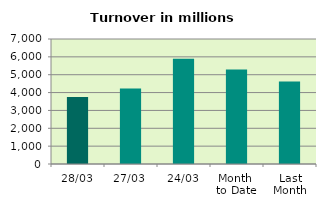
| Category | Series 0 |
|---|---|
| 28/03 | 3755.522 |
| 27/03 | 4224.266 |
| 24/03 | 5898.219 |
| Month 
to Date | 5298.255 |
| Last
Month | 4623.097 |